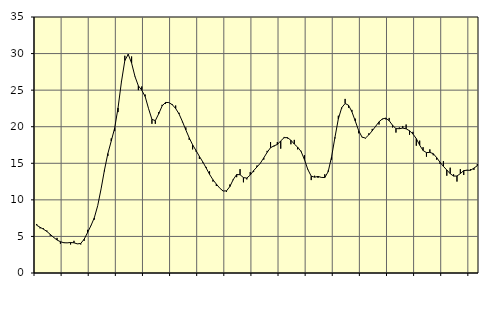
| Category | Piggar | Series 1 |
|---|---|---|
| nan | 6.7 | 6.53 |
| 87.0 | 6.1 | 6.25 |
| 87.0 | 6.1 | 5.99 |
| 87.0 | 5.8 | 5.68 |
| nan | 5.1 | 5.28 |
| 88.0 | 4.9 | 4.87 |
| 88.0 | 4.8 | 4.51 |
| 88.0 | 4 | 4.28 |
| nan | 4.2 | 4.14 |
| 89.0 | 4.1 | 4.12 |
| 89.0 | 3.9 | 4.17 |
| 89.0 | 4.4 | 4.13 |
| nan | 4 | 3.98 |
| 90.0 | 3.9 | 4.04 |
| 90.0 | 4.4 | 4.62 |
| 90.0 | 5.9 | 5.52 |
| nan | 6.5 | 6.47 |
| 91.0 | 7.3 | 7.55 |
| 91.0 | 9.2 | 9.2 |
| 91.0 | 11.5 | 11.5 |
| nan | 13.9 | 14.08 |
| 92.0 | 16 | 16.33 |
| 92.0 | 18.4 | 18.05 |
| 92.0 | 19.4 | 19.8 |
| nan | 22 | 22.57 |
| 93.0 | 26.2 | 26.13 |
| 93.0 | 29.7 | 29.04 |
| 93.0 | 29.8 | 29.9 |
| nan | 29.6 | 28.7 |
| 94.0 | 26.9 | 26.86 |
| 94.0 | 25 | 25.59 |
| 94.0 | 25.5 | 24.99 |
| nan | 24.4 | 24.13 |
| 95.0 | 22.5 | 22.48 |
| 95.0 | 20.4 | 21.01 |
| 95.0 | 20.4 | 20.83 |
| nan | 22 | 21.77 |
| 96.0 | 23 | 22.83 |
| 96.0 | 23.1 | 23.32 |
| 96.0 | 23.3 | 23.3 |
| nan | 23.1 | 23.01 |
| 97.0 | 22.9 | 22.49 |
| 97.0 | 21.9 | 21.75 |
| 97.0 | 20.6 | 20.71 |
| nan | 19.9 | 19.56 |
| 98.0 | 18.2 | 18.48 |
| 98.0 | 16.9 | 17.53 |
| 98.0 | 16.6 | 16.75 |
| nan | 15.6 | 15.95 |
| 99.0 | 15.1 | 15.19 |
| 99.0 | 14.5 | 14.36 |
| 99.0 | 13.9 | 13.49 |
| nan | 12.5 | 12.75 |
| 0.0 | 11.9 | 12.16 |
| 0.0 | 11.6 | 11.61 |
| 0.0 | 11.2 | 11.21 |
| nan | 11.1 | 11.23 |
| 1.0 | 12.1 | 11.82 |
| 1.0 | 12.7 | 12.79 |
| 1.0 | 13.1 | 13.46 |
| nan | 14.2 | 13.44 |
| 2.0 | 12.4 | 13.04 |
| 2.0 | 12.8 | 12.98 |
| 2.0 | 13.8 | 13.39 |
| nan | 13.8 | 14 |
| 3.0 | 14.7 | 14.5 |
| 3.0 | 15 | 15.02 |
| 3.0 | 15.5 | 15.74 |
| nan | 16.7 | 16.5 |
| 4.0 | 17.9 | 17.13 |
| 4.0 | 17.3 | 17.38 |
| 4.0 | 17.9 | 17.57 |
| nan | 17 | 18.06 |
| 5.0 | 18.6 | 18.5 |
| 5.0 | 18.4 | 18.51 |
| 5.0 | 17.6 | 18.15 |
| nan | 18.2 | 17.63 |
| 6.0 | 16.9 | 17.2 |
| 6.0 | 16.7 | 16.62 |
| 6.0 | 16.1 | 15.51 |
| nan | 14.2 | 14.15 |
| 7.0 | 12.7 | 13.24 |
| 7.0 | 13.3 | 13.1 |
| 7.0 | 13 | 13.2 |
| nan | 13.1 | 13.07 |
| 8.0 | 13.5 | 13.05 |
| 8.0 | 14 | 13.85 |
| 8.0 | 15.5 | 15.88 |
| nan | 18.4 | 18.55 |
| 9.0 | 21.5 | 21.07 |
| 9.0 | 22.5 | 22.61 |
| 9.0 | 23.8 | 23.17 |
| nan | 22.6 | 22.94 |
| 10.0 | 22.3 | 22.05 |
| 10.0 | 21.1 | 20.77 |
| 10.0 | 19.1 | 19.46 |
| nan | 18.6 | 18.57 |
| 11.0 | 18.4 | 18.45 |
| 11.0 | 19.1 | 18.89 |
| 11.0 | 19.7 | 19.44 |
| nan | 20 | 20.06 |
| 12.0 | 20.3 | 20.67 |
| 12.0 | 21 | 21.07 |
| 12.0 | 21 | 21.17 |
| nan | 21.2 | 20.82 |
| 13.0 | 19.9 | 20.19 |
| 13.0 | 19.2 | 19.74 |
| 13.0 | 19.9 | 19.73 |
| nan | 20.1 | 19.81 |
| 14.0 | 20.3 | 19.71 |
| 14.0 | 18.9 | 19.45 |
| 14.0 | 19.3 | 19.01 |
| nan | 17.4 | 18.37 |
| 15.0 | 18.1 | 17.48 |
| 15.0 | 17.2 | 16.75 |
| 15.0 | 15.9 | 16.46 |
| nan | 16.9 | 16.49 |
| 16.0 | 16.1 | 16.32 |
| 16.0 | 15.5 | 15.78 |
| 16.0 | 14.9 | 15.14 |
| nan | 15.3 | 14.58 |
| 17.0 | 13.3 | 14.08 |
| 17.0 | 14.4 | 13.58 |
| 17.0 | 13.5 | 13.25 |
| nan | 12.5 | 13.26 |
| 18.0 | 14.2 | 13.59 |
| 18.0 | 13.4 | 14 |
| 18.0 | 14.1 | 14.05 |
| nan | 14.2 | 14.04 |
| 19.0 | 14.1 | 14.34 |
| 19.0 | 14.9 | 14.67 |